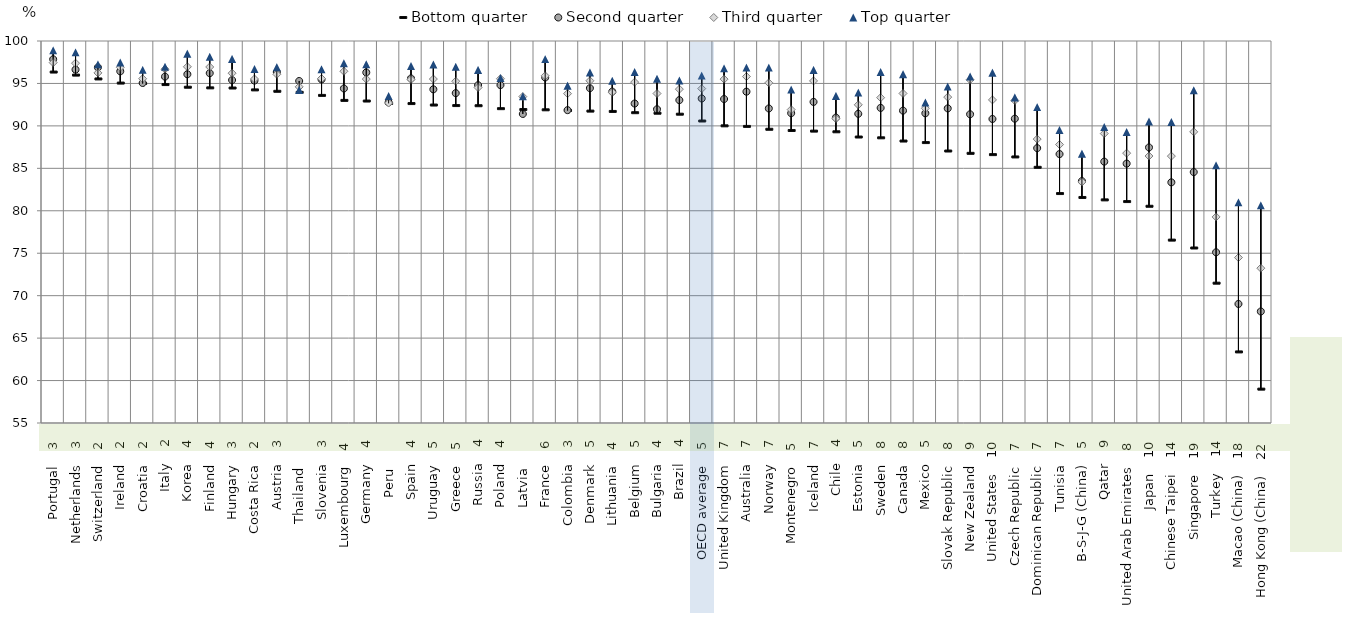
| Category | Bottom quarter | Second quarter | Third quarter | Top quarter |
|---|---|---|---|---|
| Portugal    3 | 96.342 | 97.847 | 97.452 | 98.898 |
| Netherlands    3 | 95.982 | 96.632 | 97.386 | 98.662 |
| Switzerland    2 | 95.53 | 96.889 | 96.242 | 97.247 |
| Ireland    2 | 95.042 | 96.429 | 96.903 | 97.459 |
| Croatia    2 | 94.994 | 95.052 | 95.56 | 96.599 |
| Italy    2 | 94.867 | 95.803 | 96.681 | 96.973 |
| Korea    4 | 94.554 | 96.083 | 96.964 | 98.51 |
| Finland    4 | 94.479 | 96.21 | 96.94 | 98.149 |
| Hungary    3 | 94.461 | 95.397 | 96.208 | 97.892 |
| Costa Rica    2 | 94.239 | 95.337 | 95.529 | 96.704 |
| Austria    3 | 94.074 | 96.336 | 96.081 | 96.917 |
| Thailand        | 93.951 | 95.29 | 94.601 | 94.234 |
| Slovenia    3 | 93.591 | 95.476 | 95.575 | 96.669 |
| Luxembourg    4 | 93.002 | 94.407 | 96.436 | 97.382 |
| Germany    4 | 92.927 | 96.293 | 95.515 | 97.257 |
| Peru        | 92.645 | 92.773 | 92.693 | 93.532 |
| Spain    4 | 92.629 | 95.588 | 95.469 | 97.058 |
| Uruguay    5 | 92.457 | 94.308 | 95.52 | 97.22 |
| Greece    5 | 92.393 | 93.857 | 95.262 | 96.968 |
| Russia    4 | 92.375 | 94.797 | 94.512 | 96.593 |
| Poland    4 | 92.028 | 94.807 | 95.556 | 95.639 |
| Latvia        | 91.926 | 91.404 | 93.449 | 93.492 |
| France    6 | 91.895 | 95.701 | 95.902 | 97.866 |
| Colombia    3 | 91.81 | 91.853 | 93.799 | 94.733 |
| Denmark    5 | 91.741 | 94.445 | 95.316 | 96.301 |
| Lithuania    4 | 91.702 | 94.037 | 93.966 | 95.316 |
| Belgium    5 | 91.555 | 92.634 | 95.155 | 96.353 |
| Bulgaria    4 | 91.493 | 91.958 | 93.813 | 95.542 |
| Brazil    4 | 91.378 | 93.036 | 94.327 | 95.354 |
| OECD average    5 | 90.575 | 93.229 | 94.392 | 95.923 |
| United Kingdom    7 | 90.006 | 93.164 | 95.509 | 96.782 |
| Australia    7 | 89.938 | 94.03 | 95.811 | 96.871 |
| Norway    7 | 89.6 | 92.054 | 95.07 | 96.873 |
| Montenegro    5 | 89.456 | 91.496 | 91.917 | 94.277 |
| Iceland    7 | 89.385 | 92.824 | 95.299 | 96.595 |
| Chile    4 | 89.306 | 90.976 | 90.86 | 93.529 |
| Estonia    5 | 88.688 | 91.423 | 92.484 | 93.919 |
| Sweden    8 | 88.595 | 92.116 | 93.324 | 96.336 |
| Canada    8 | 88.214 | 91.798 | 93.822 | 96.098 |
| Mexico    5 | 88.033 | 91.488 | 92.074 | 92.758 |
| Slovak Republic    8 | 87.038 | 92.062 | 93.39 | 94.628 |
| New Zealand    9 | 86.766 | 91.369 | 95.435 | 95.82 |
| United States    10 | 86.615 | 90.814 | 93.061 | 96.265 |
| Czech Republic    7 | 86.341 | 90.848 | 92.988 | 93.351 |
| Dominican Republic    7 | 85.12 | 87.38 | 88.445 | 92.222 |
| Tunisia    7 | 82.029 | 86.679 | 87.802 | 89.514 |
| B-S-J-G (China)    5 | 81.566 | 83.499 | 83.398 | 86.732 |
| Qatar    9 | 81.283 | 85.789 | 89.094 | 89.865 |
| United Arab Emirates    8 | 81.085 | 85.557 | 86.789 | 89.28 |
| Japan    10 | 80.531 | 87.463 | 86.45 | 90.51 |
| Chinese Taipei    14 | 76.545 | 83.35 | 86.44 | 90.455 |
| Singapore    19 | 75.616 | 84.561 | 89.299 | 94.204 |
| Turkey    14 | 71.471 | 75.112 | 79.275 | 85.354 |
| Macao (China)    18 | 63.374 | 69.024 | 74.49 | 80.996 |
| Hong Kong (China)    22 | 58.989 | 68.139 | 73.237 | 80.642 |